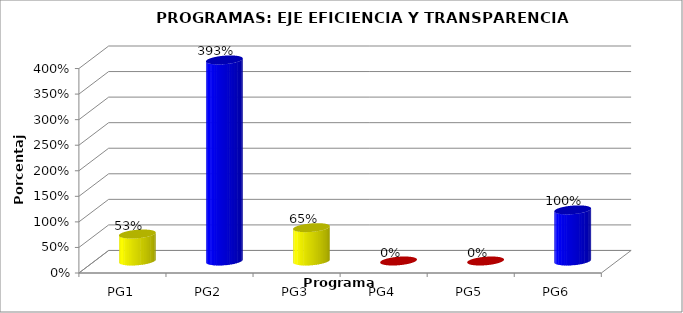
| Category | Series 0 |
|---|---|
| PG1 | 0.528 |
| PG2 | 3.933 |
| PG3 | 0.653 |
| PG4 | 0 |
| PG5 | 0 |
| PG6 | 1 |